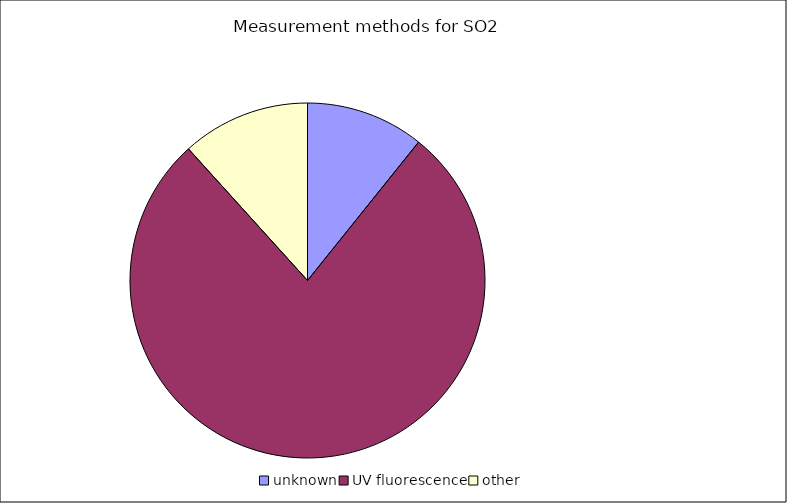
| Category | Series 0 |
|---|---|
| unknown | 10.766 |
| UV fluorescence | 77.53 |
| other | 11.703 |